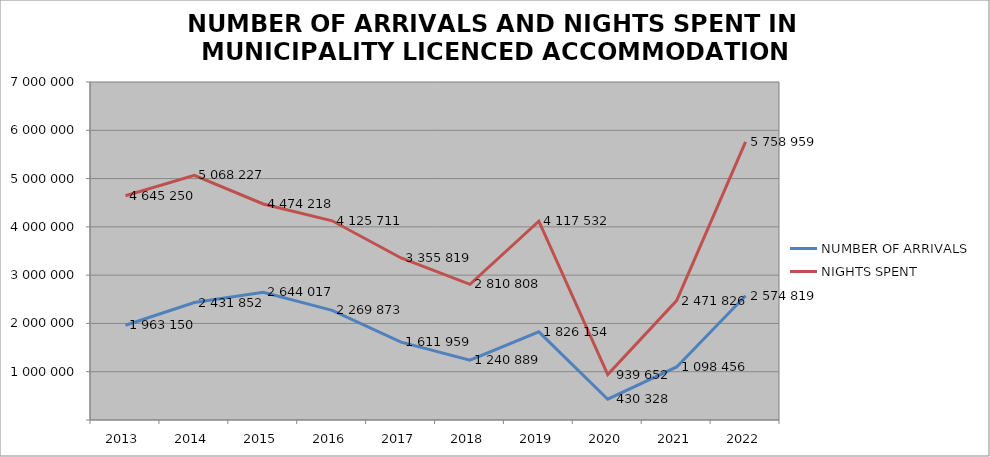
| Category | NUMBER OF ARRIVALS | NIGHTS SPENT |
|---|---|---|
| 2013 | 1963150 | 4645250 |
| 2014 | 2431852 | 5068227 |
| 2015 | 2644017 | 4474218 |
| 2016 | 2269873 | 4125711 |
| 2017 | 1611959 | 3355819 |
| 2018 | 1240889 | 2810808 |
| 2019 | 1826154 | 4117532 |
| 2020 | 430328 | 939652 |
| 2021 | 1098456 | 2471826 |
| 2022 | 2574819 | 5758959 |